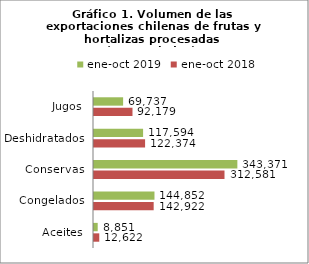
| Category | ene-oct 2018 | ene-oct 2019 |
|---|---|---|
| Aceites | 12621599.469 | 8851241.58 |
| Congelados | 142922388.725 | 144851922.806 |
| Conservas | 312580781.552 | 343370924.268 |
| Deshidratados | 122373922.057 | 117594252.21 |
| Jugos | 92178709.942 | 69736639.065 |